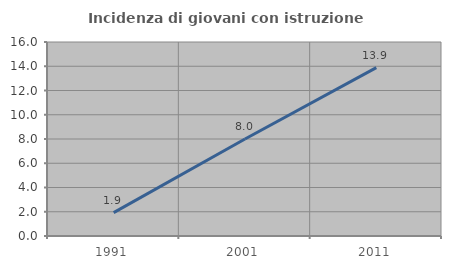
| Category | Incidenza di giovani con istruzione universitaria |
|---|---|
| 1991.0 | 1.923 |
| 2001.0 | 8 |
| 2011.0 | 13.889 |